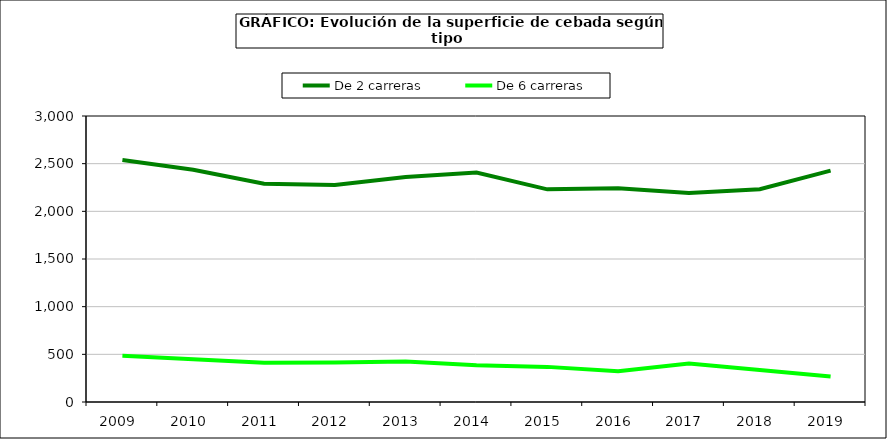
| Category | De 2 carreras | De 6 carreras |
|---|---|---|
| 2009  | 2538.767 | 485.959 |
| 2010  | 2436.435 | 449.177 |
| 2011  | 2289.976 | 410.703 |
| 2012  | 2276.855 | 414.231 |
| 2013  | 2360.129 | 424.153 |
| 2014  | 2407.693 | 384.533 |
| 2015  | 2230.462 | 368.434 |
| 2016  | 2241.385 | 321.81 |
| 2017  | 2192.938 | 404.589 |
| 2018  | 2232.782 | 336.68 |
| 2019  | 2426.41 | 267.098 |